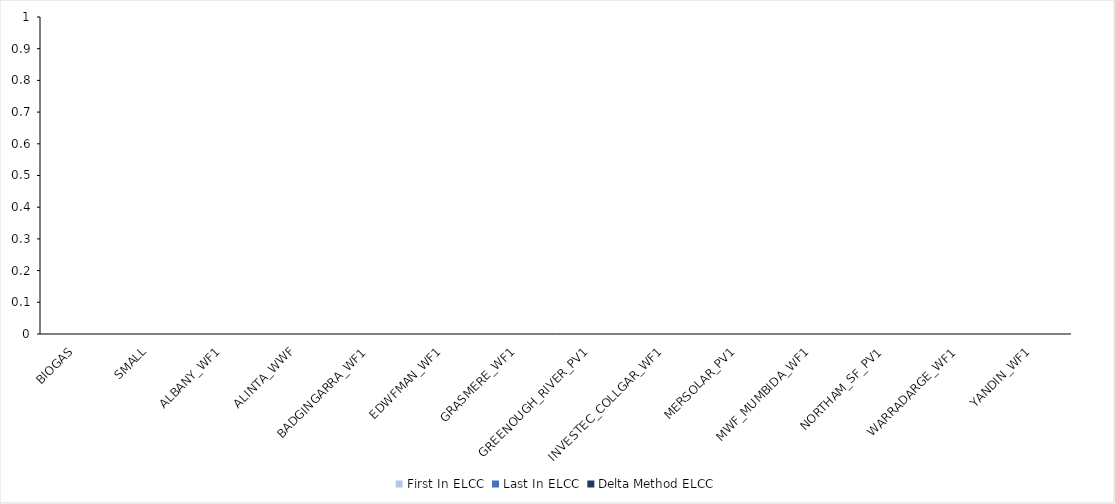
| Category | First In ELCC | Last In ELCC | Delta Method ELCC |
|---|---|---|---|
| BIOGAS |  |  | 0 |
| SMALL |  |  | 0 |
| ALBANY_WF1 |  |  | 0 |
| ALINTA_WWF |  |  | 0 |
| BADGINGARRA_WF1 |  |  | 0 |
| EDWFMAN_WF1 |  |  | 0 |
| GRASMERE_WF1 |  |  | 0 |
| GREENOUGH_RIVER_PV1 |  |  | 0 |
| INVESTEC_COLLGAR_WF1 |  |  | 0 |
| MERSOLAR_PV1 |  |  | 0 |
| MWF_MUMBIDA_WF1 |  |  | 0 |
| NORTHAM_SF_PV1 |  |  | 0 |
| WARRADARGE_WF1 |  |  | 0 |
| YANDIN_WF1 |  |  | 0 |